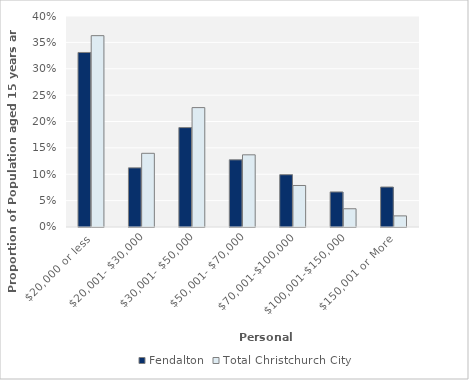
| Category | Fendalton | Total Christchurch City |
|---|---|---|
| $20,000 or less | 0.331 | 0.363 |
| $20,001- $30,000 | 0.112 | 0.14 |
| $30,001- $50,000 | 0.188 | 0.226 |
| $50,001- $70,000 | 0.127 | 0.137 |
| $70,001-$100,000 | 0.099 | 0.079 |
| $100,001-$150,000 | 0.066 | 0.035 |
| $150,001 or More | 0.076 | 0.021 |